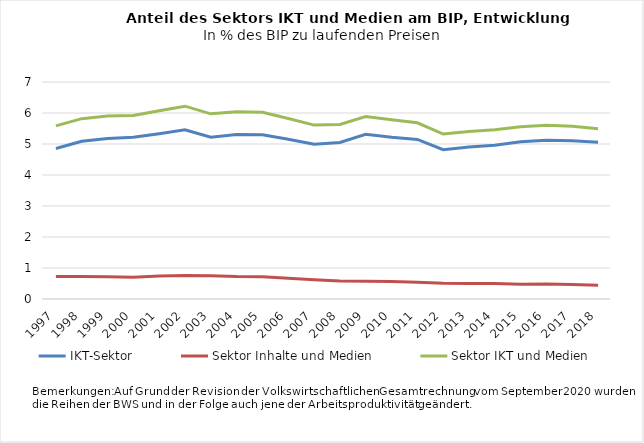
| Category | IKT-Sektor | Sektor Inhalte und Medien | Sektor IKT und Medien |
|---|---|---|---|
| 1997.0 | 4.855 | 0.729 | 5.585 |
| 1998.0 | 5.088 | 0.729 | 5.817 |
| 1999.0 | 5.18 | 0.72 | 5.9 |
| 2000.0 | 5.215 | 0.704 | 5.919 |
| 2001.0 | 5.331 | 0.739 | 6.071 |
| 2002.0 | 5.461 | 0.759 | 6.22 |
| 2003.0 | 5.22 | 0.754 | 5.974 |
| 2004.0 | 5.31 | 0.728 | 6.038 |
| 2005.0 | 5.301 | 0.721 | 6.023 |
| 2006.0 | 5.156 | 0.667 | 5.823 |
| 2007.0 | 4.991 | 0.619 | 5.609 |
| 2008.0 | 5.047 | 0.583 | 5.63 |
| 2009.0 | 5.312 | 0.574 | 5.886 |
| 2010.0 | 5.216 | 0.568 | 5.784 |
| 2011.0 | 5.147 | 0.537 | 5.684 |
| 2012.0 | 4.815 | 0.505 | 5.32 |
| 2013.0 | 4.904 | 0.499 | 5.403 |
| 2014.0 | 4.959 | 0.502 | 5.461 |
| 2015.0 | 5.075 | 0.48 | 5.555 |
| 2016.0 | 5.119 | 0.485 | 5.603 |
| 2017.0 | 5.108 | 0.464 | 5.572 |
| 2018.0 | 5.055 | 0.44 | 5.496 |